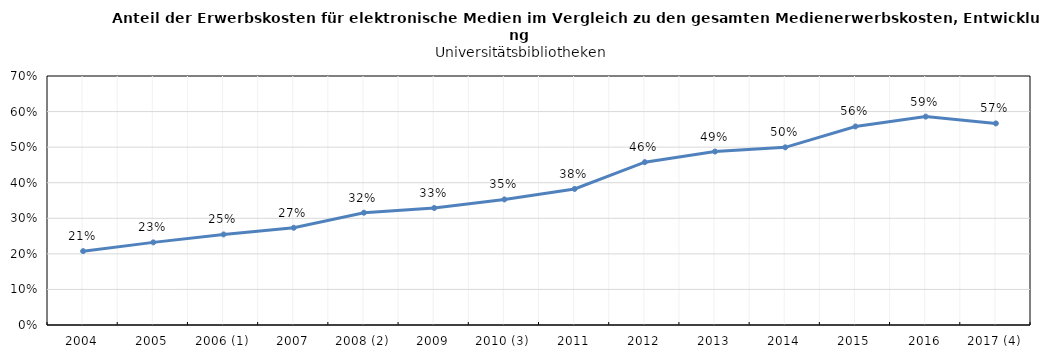
| Category | Series 0 |
|---|---|
| 2004 | 0.208 |
| 2005 | 0.232 |
| 2006 (1) | 0.255 |
| 2007 | 0.273 |
| 2008 (2) | 0.316 |
| 2009 | 0.329 |
| 2010 (3) | 0.353 |
| 2011 | 0.382 |
| 2012 | 0.458 |
| 2013 | 0.488 |
| 2014 | 0.499 |
| 2015 | 0.558 |
| 2016 | 0.586 |
| 2017 (4) | 0.567 |